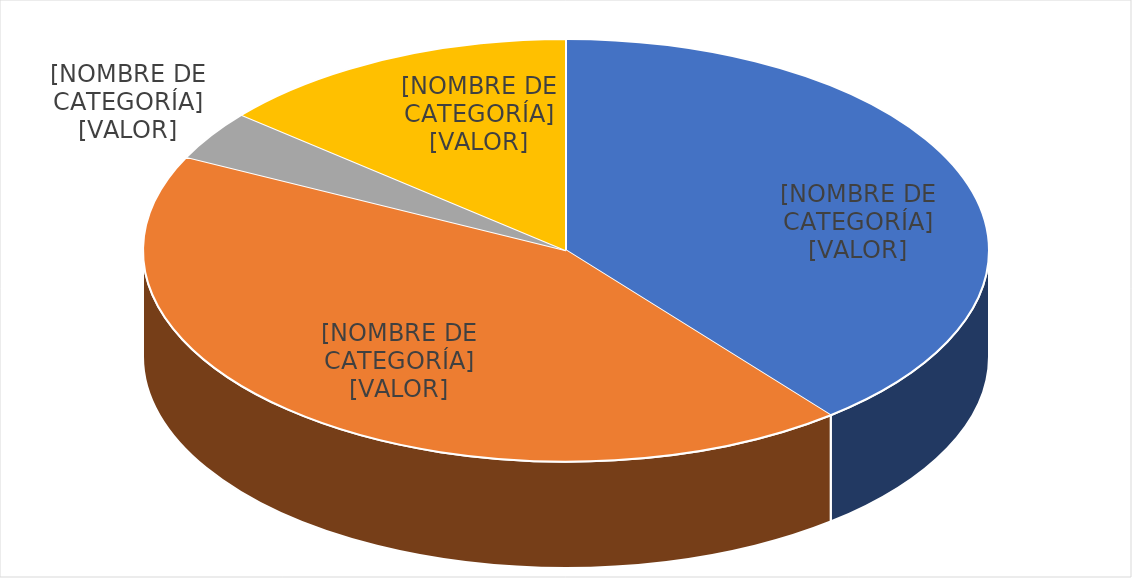
| Category | % |
|---|---|
| < = 40% | 0.392 |
| > 40% Y < = 70% | 0.43 |
| > 70% Y < = 90% | 0.038 |
| >90% | 0.139 |